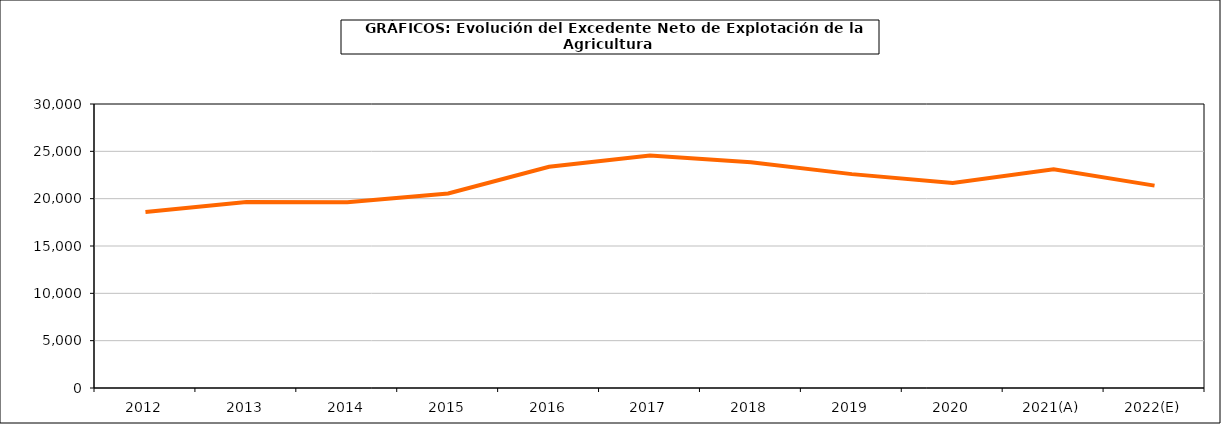
| Category | excedente neto de explotacion |
|---|---|
| 2012 | 18589.082 |
| 2013 | 19635.617 |
| 2014 | 19616.041 |
| 2015 | 20539.815 |
| 2016 | 23367.672 |
| 2017 | 24560.03 |
| 2018 | 23855 |
| 2019 | 22592.02 |
| 2020 | 21650.775 |
| 2021(A) | 23094.202 |
| 2022(E) | 21378.709 |